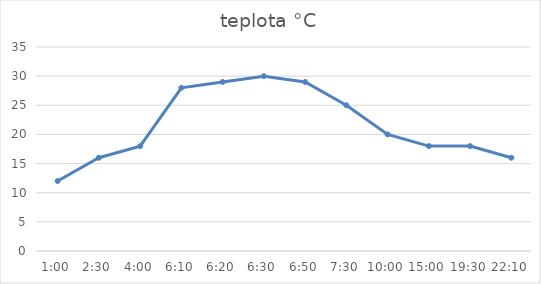
| Category | teplota °C |
|---|---|
| 0.041666666666666664 | 12 |
| 0.10416666666666667 | 16 |
| 0.16666666666666666 | 18 |
| 0.2569444444444445 | 28 |
| 0.2638888888888889 | 29 |
| 0.2708333333333333 | 30 |
| 0.2847222222222222 | 29 |
| 0.3125 | 25 |
| 0.4166666666666667 | 20 |
| 0.625 | 18 |
| 0.8125 | 18 |
| 0.9236111111111112 | 16 |